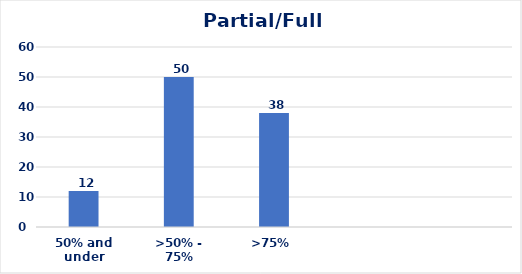
| Category | Percent |
|---|---|
| 50% and under | 12 |
| >50% - 75% | 50 |
| >75%  | 38 |